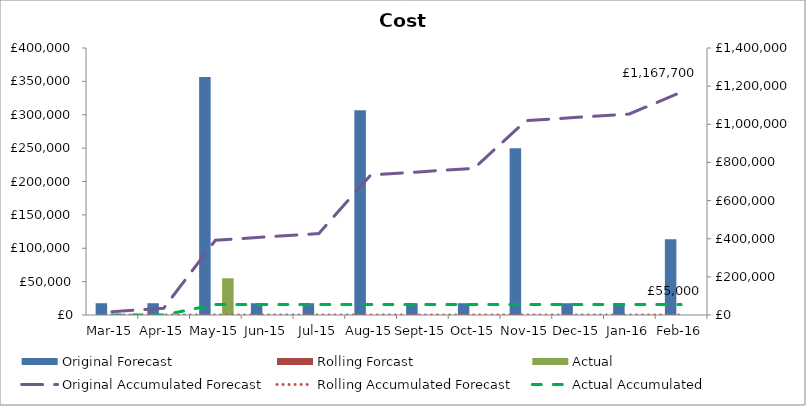
| Category | Original Forecast | Rolling Forcast | Actual |
|---|---|---|---|
| 2015-03-01 | 17641.65 | 0 | 0 |
| 2015-04-01 | 17641.65 | 0 | 0 |
| 2015-05-01 | 356683.3 | 0 | 55000 |
| 2015-06-01 | 17641.65 | 0 | 0 |
| 2015-07-01 | 17641.65 | 0 | 0 |
| 2015-08-01 | 306683.3 | 0 | 0 |
| 2015-09-01 | 17641.65 | 0 | 0 |
| 2015-10-01 | 17641.65 | 0 | 0 |
| 2015-11-01 | 249683.3 | 0 | 0 |
| 2015-12-01 | 17641.65 | 0 | 0 |
| 2016-01-01 | 17641.65 | 0 | 0 |
| 2016-02-01 | 113516.65 | 0 | 0 |